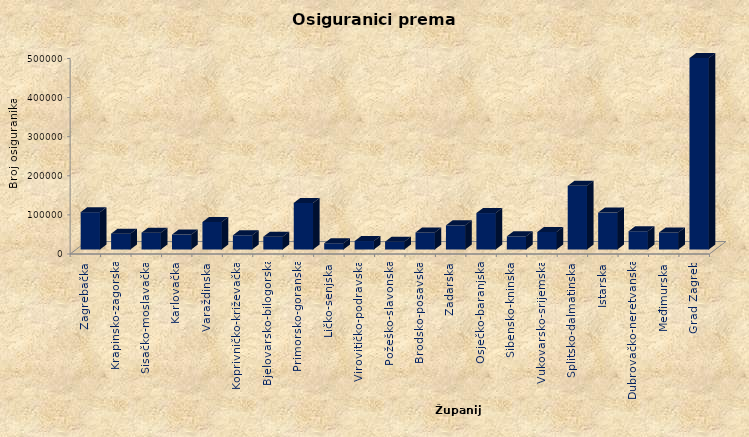
| Category | Series 0 |
|---|---|
| Zagrebačka | 95425 |
| Krapinsko-zagorska | 40469 |
| Sisačko-moslavačka | 43026 |
| Karlovačka | 38142 |
| Varaždinska | 70332 |
| Koprivničko-križevačka | 36344 |
| Bjelovarsko-bilogorska | 32579 |
| Primorsko-goranska | 119079 |
| Ličko-senjska | 15954 |
| Virovitičko-podravska | 21646 |
| Požeško-slavonska | 19970 |
| Brodsko-posavska | 43533 |
| Zadarska | 61783 |
| Osječko-baranjska | 93206 |
| Šibensko-kninska | 33669 |
| Vukovarsko-srijemska | 44705 |
| Splitsko-dalmatinska | 162718 |
| Istarska | 94358 |
| Dubrovačko-neretvanska | 46687 |
| Međimurska | 43473 |
| Grad Zagreb | 489442 |